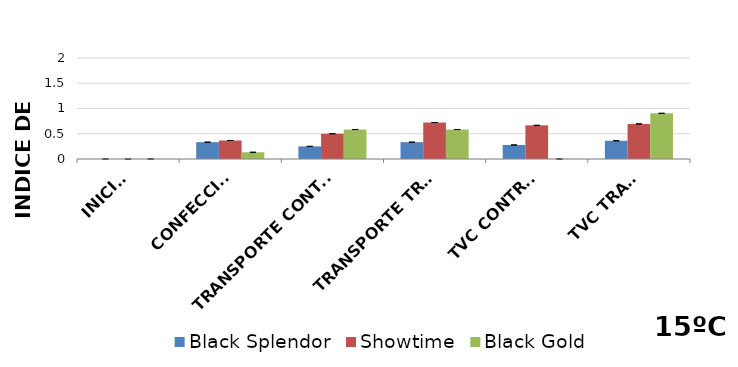
| Category | Black Splendor | Showtime | Black Gold |
|---|---|---|---|
| INICIAL | 0 | 0 | 0 |
| CONFECCIÓN | 0.333 | 0.367 | 0.133 |
| TRANSPORTE CONTROL | 0.25 | 0.5 | 0.583 |
| TRANSPORTE TRAT. | 0.333 | 0.722 | 0.583 |
| TVC CONTROL | 0.278 | 0.667 | 0 |
| TVC TRAT. | 0.361 | 0.694 | 0.905 |